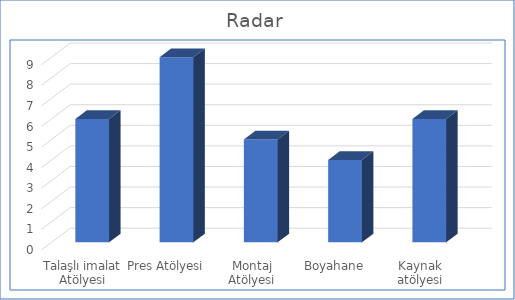
| Category | Radar |
|---|---|
| Talaşlı imalat Atölyesi | 6 |
| Pres Atölyesi | 9 |
| Montaj Atölyesi | 5 |
| Boyahane | 4 |
| Kaynak atölyesi | 6 |